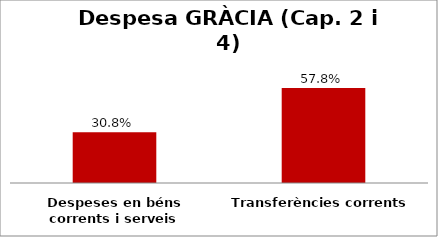
| Category | Series 0 |
|---|---|
| Despeses en béns corrents i serveis | 0.308 |
| Transferències corrents | 0.578 |